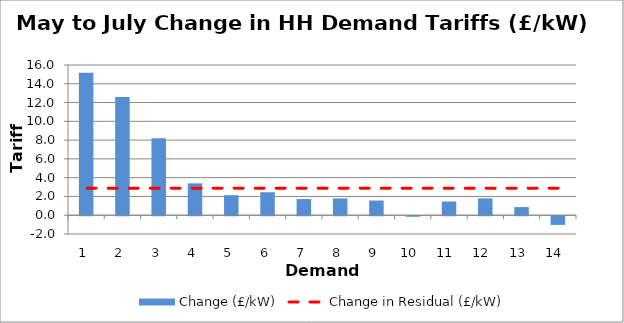
| Category | Change (£/kW) |
|---|---|
| 1.0 | 15.169 |
| 2.0 | 12.586 |
| 3.0 | 8.203 |
| 4.0 | 3.394 |
| 5.0 | 2.129 |
| 6.0 | 2.449 |
| 7.0 | 1.721 |
| 8.0 | 1.788 |
| 9.0 | 1.565 |
| 10.0 | -0.055 |
| 11.0 | 1.463 |
| 12.0 | 1.797 |
| 13.0 | 0.864 |
| 14.0 | -0.925 |